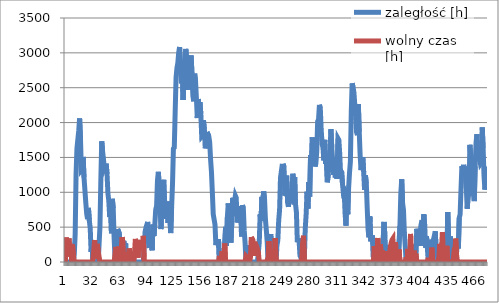
| Category | zaległość [h] | wolny czas [h] |
|---|---|---|
| 0 | 40 | 0 |
| 1 | 0 | 352 |
| 2 | 0 | 124 |
| 3 | 0 | 181 |
| 4 | 0 | 338 |
| 5 | 0 | 81 |
| 6 | 0 | 260 |
| 7 | 0 | 3 |
| 8 | 0 | 248 |
| 9 | 0 | 95 |
| 10 | 114 | 0 |
| 11 | 401 | 0 |
| 12 | 1257 | 0 |
| 13 | 1628 | 0 |
| 14 | 1640 | 0 |
| 15 | 1880 | 0 |
| 16 | 2059 | 0 |
| 17 | 1775 | 0 |
| 18 | 1319 | 0 |
| 19 | 1335 | 0 |
| 20 | 1507 | 0 |
| 21 | 1209 | 0 |
| 22 | 1223 | 0 |
| 23 | 851 | 0 |
| 24 | 693 | 0 |
| 25 | 614 | 0 |
| 26 | 776 | 0 |
| 27 | 593 | 0 |
| 28 | 486 | 0 |
| 29 | 145 | 0 |
| 30 | 280 | 0 |
| 31 | 0 | 30 |
| 32 | 0 | 174 |
| 33 | 0 | 314 |
| 34 | 0 | 52 |
| 35 | 0 | 99 |
| 36 | 0 | 260 |
| 37 | 0 | 154 |
| 38 | 0 | 77 |
| 39 | 506 | 0 |
| 40 | 1173 | 0 |
| 41 | 1731 | 0 |
| 42 | 1585 | 0 |
| 43 | 1471 | 0 |
| 44 | 1342 | 0 |
| 45 | 1370 | 0 |
| 46 | 1411 | 0 |
| 47 | 1264 | 0 |
| 48 | 984 | 0 |
| 49 | 876 | 0 |
| 50 | 645 | 0 |
| 51 | 805 | 0 |
| 52 | 412 | 0 |
| 53 | 906 | 0 |
| 54 | 771 | 0 |
| 55 | 350 | 0 |
| 56 | 69 | 0 |
| 57 | 0 | 218 |
| 58 | 0 | 182 |
| 59 | 473 | 0 |
| 60 | 476 | 0 |
| 61 | 405 | 0 |
| 62 | 198 | 0 |
| 63 | 0 | 181 |
| 64 | 0 | 356 |
| 65 | 0 | 274 |
| 66 | 304 | 0 |
| 67 | 0 | 77 |
| 68 | 267 | 0 |
| 69 | 0 | 21 |
| 70 | 132 | 0 |
| 71 | 0 | 1 |
| 72 | 0 | 194 |
| 73 | 0 | 140 |
| 74 | 0 | 8 |
| 75 | 71 | 0 |
| 76 | 0 | 115 |
| 77 | 29 | 0 |
| 78 | 0 | 115 |
| 79 | 0 | 331 |
| 80 | 0 | 271 |
| 81 | 0 | 312 |
| 82 | 0 | 63 |
| 83 | 0 | 305 |
| 84 | 0 | 214 |
| 85 | 0 | 317 |
| 86 | 0 | 239 |
| 87 | 0 | 223 |
| 88 | 0 | 375 |
| 89 | 220 | 0 |
| 90 | 430 | 0 |
| 91 | 494 | 0 |
| 92 | 485 | 0 |
| 93 | 575 | 0 |
| 94 | 287 | 0 |
| 95 | 202 | 0 |
| 96 | 282 | 0 |
| 97 | 322 | 0 |
| 98 | 168 | 0 |
| 99 | 536 | 0 |
| 100 | 376 | 0 |
| 101 | 534 | 0 |
| 102 | 750 | 0 |
| 103 | 800 | 0 |
| 104 | 1169 | 0 |
| 105 | 1293 | 0 |
| 106 | 1077 | 0 |
| 107 | 777 | 0 |
| 108 | 472 | 0 |
| 109 | 821 | 0 |
| 110 | 742 | 0 |
| 111 | 1179 | 0 |
| 112 | 885 | 0 |
| 113 | 818 | 0 |
| 114 | 620 | 0 |
| 115 | 810 | 0 |
| 116 | 562 | 0 |
| 117 | 867 | 0 |
| 118 | 572 | 0 |
| 119 | 415 | 0 |
| 120 | 789 | 0 |
| 121 | 1123 | 0 |
| 122 | 1626 | 0 |
| 123 | 1642 | 0 |
| 124 | 2155 | 0 |
| 125 | 2644 | 0 |
| 126 | 2783 | 0 |
| 127 | 2854 | 0 |
| 128 | 3006 | 0 |
| 129 | 3084 | 0 |
| 130 | 2784 | 0 |
| 131 | 2561 | 0 |
| 132 | 2747 | 0 |
| 133 | 2324 | 0 |
| 134 | 2777 | 0 |
| 135 | 2784 | 0 |
| 136 | 3057 | 0 |
| 137 | 2922 | 0 |
| 138 | 2589 | 0 |
| 139 | 2470 | 0 |
| 140 | 2691 | 0 |
| 141 | 2879 | 0 |
| 142 | 2963 | 0 |
| 143 | 2693 | 0 |
| 144 | 2381 | 0 |
| 145 | 2306 | 0 |
| 146 | 2701 | 0 |
| 147 | 2601 | 0 |
| 148 | 2351 | 0 |
| 149 | 2065 | 0 |
| 150 | 2337 | 0 |
| 151 | 2203 | 0 |
| 152 | 2293 | 0 |
| 153 | 2124 | 0 |
| 154 | 1800 | 0 |
| 155 | 1815 | 0 |
| 156 | 2035 | 0 |
| 157 | 1893 | 0 |
| 158 | 1630 | 0 |
| 159 | 1698 | 0 |
| 160 | 1864 | 0 |
| 161 | 1877 | 0 |
| 162 | 1804 | 0 |
| 163 | 1719 | 0 |
| 164 | 1476 | 0 |
| 165 | 1294 | 0 |
| 166 | 1003 | 0 |
| 167 | 686 | 0 |
| 168 | 681 | 0 |
| 169 | 536 | 0 |
| 170 | 241 | 0 |
| 171 | 286 | 0 |
| 172 | 265 | 0 |
| 173 | 328 | 0 |
| 174 | 0 | 89 |
| 175 | 0 | 25 |
| 176 | 126 | 0 |
| 177 | 0 | 154 |
| 178 | 149 | 0 |
| 179 | 0 | 103 |
| 180 | 0 | 266 |
| 181 | 503 | 0 |
| 182 | 233 | 0 |
| 183 | 647 | 0 |
| 184 | 840 | 0 |
| 185 | 644 | 0 |
| 186 | 612 | 0 |
| 187 | 278 | 0 |
| 188 | 571 | 0 |
| 189 | 921 | 0 |
| 190 | 658 | 0 |
| 191 | 859 | 0 |
| 192 | 951 | 0 |
| 193 | 921 | 0 |
| 194 | 567 | 0 |
| 195 | 643 | 0 |
| 196 | 573 | 0 |
| 197 | 802 | 0 |
| 198 | 715 | 0 |
| 199 | 366 | 0 |
| 200 | 814 | 0 |
| 201 | 777 | 0 |
| 202 | 457 | 0 |
| 203 | 277 | 0 |
| 204 | 0 | 83 |
| 205 | 0 | 68 |
| 206 | 239 | 0 |
| 207 | 66 | 0 |
| 208 | 50 | 0 |
| 209 | 0 | 64 |
| 210 | 0 | 357 |
| 211 | 0 | 358 |
| 212 | 0 | 305 |
| 213 | 0 | 86 |
| 214 | 0 | 290 |
| 215 | 0 | 204 |
| 216 | 0 | 168 |
| 217 | 0 | 184 |
| 218 | 0 | 142 |
| 219 | 276 | 0 |
| 220 | 683 | 0 |
| 221 | 589 | 0 |
| 222 | 934 | 0 |
| 223 | 863 | 0 |
| 224 | 1012 | 0 |
| 225 | 901 | 0 |
| 226 | 609 | 0 |
| 227 | 459 | 0 |
| 228 | 285 | 0 |
| 229 | 0 | 63 |
| 230 | 0 | 301 |
| 231 | 313 | 0 |
| 232 | 401 | 0 |
| 233 | 194 | 0 |
| 234 | 0 | 103 |
| 235 | 263 | 0 |
| 236 | 0 | 98 |
| 237 | 0 | 344 |
| 238 | 0 | 12 |
| 239 | 239 | 0 |
| 240 | 310 | 0 |
| 241 | 597 | 0 |
| 242 | 751 | 0 |
| 243 | 1208 | 0 |
| 244 | 1300 | 0 |
| 245 | 1274 | 0 |
| 246 | 1408 | 0 |
| 247 | 1363 | 0 |
| 248 | 952 | 0 |
| 249 | 1182 | 0 |
| 250 | 1241 | 0 |
| 251 | 854 | 0 |
| 252 | 792 | 0 |
| 253 | 926 | 0 |
| 254 | 919 | 0 |
| 255 | 897 | 0 |
| 256 | 894 | 0 |
| 257 | 1266 | 0 |
| 258 | 1141 | 0 |
| 259 | 1218 | 0 |
| 260 | 829 | 0 |
| 261 | 713 | 0 |
| 262 | 314 | 0 |
| 263 | 324 | 0 |
| 264 | 310 | 0 |
| 265 | 93 | 0 |
| 266 | 67 | 0 |
| 267 | 0 | 34 |
| 268 | 0 | 269 |
| 269 | 0 | 376 |
| 270 | 76 | 0 |
| 271 | 483 | 0 |
| 272 | 682 | 0 |
| 273 | 1008 | 0 |
| 274 | 767 | 0 |
| 275 | 1148 | 0 |
| 276 | 939 | 0 |
| 277 | 1535 | 0 |
| 278 | 1428 | 0 |
| 279 | 1787 | 0 |
| 280 | 1507 | 0 |
| 281 | 1565 | 0 |
| 282 | 1371 | 0 |
| 283 | 1418 | 0 |
| 284 | 1584 | 0 |
| 285 | 2017 | 0 |
| 286 | 2042 | 0 |
| 287 | 2255 | 0 |
| 288 | 2202 | 0 |
| 289 | 1903 | 0 |
| 290 | 1691 | 0 |
| 291 | 1642 | 0 |
| 292 | 1457 | 0 |
| 293 | 1752 | 0 |
| 294 | 1408 | 0 |
| 295 | 1433 | 0 |
| 296 | 1144 | 0 |
| 297 | 1258 | 0 |
| 298 | 1495 | 0 |
| 299 | 1573 | 0 |
| 300 | 1906 | 0 |
| 301 | 1638 | 0 |
| 302 | 1624 | 0 |
| 303 | 1250 | 0 |
| 304 | 1388 | 0 |
| 305 | 1213 | 0 |
| 306 | 1339 | 0 |
| 307 | 1193 | 0 |
| 308 | 1771 | 0 |
| 309 | 1748 | 0 |
| 310 | 1544 | 0 |
| 311 | 1249 | 0 |
| 312 | 1309 | 0 |
| 313 | 1131 | 0 |
| 314 | 994 | 0 |
| 315 | 1009 | 0 |
| 316 | 696 | 0 |
| 317 | 521 | 0 |
| 318 | 991 | 0 |
| 319 | 685 | 0 |
| 320 | 1062 | 0 |
| 321 | 1279 | 0 |
| 322 | 1440 | 0 |
| 323 | 2153 | 0 |
| 324 | 2563 | 0 |
| 325 | 2512 | 0 |
| 326 | 2431 | 0 |
| 327 | 2248 | 0 |
| 328 | 2083 | 0 |
| 329 | 1862 | 0 |
| 330 | 1820 | 0 |
| 331 | 2265 | 0 |
| 332 | 1868 | 0 |
| 333 | 1538 | 0 |
| 334 | 1317 | 0 |
| 335 | 1324 | 0 |
| 336 | 1503 | 0 |
| 337 | 1294 | 0 |
| 338 | 1034 | 0 |
| 339 | 1243 | 0 |
| 340 | 1124 | 0 |
| 341 | 775 | 0 |
| 342 | 464 | 0 |
| 343 | 354 | 0 |
| 344 | 654 | 0 |
| 345 | 295 | 0 |
| 346 | 330 | 0 |
| 347 | 384 | 0 |
| 348 | 63 | 0 |
| 349 | 0 | 226 |
| 350 | 30 | 0 |
| 351 | 250 | 0 |
| 352 | 0 | 132 |
| 353 | 0 | 345 |
| 354 | 81 | 0 |
| 355 | 0 | 47 |
| 356 | 0 | 258 |
| 357 | 30 | 0 |
| 358 | 0 | 165 |
| 359 | 0 | 31 |
| 360 | 574 | 0 |
| 361 | 377 | 0 |
| 362 | 131 | 0 |
| 363 | 0 | 155 |
| 364 | 166 | 0 |
| 365 | 75 | 0 |
| 366 | 63 | 0 |
| 367 | 0 | 218 |
| 368 | 0 | 266 |
| 369 | 0 | 315 |
| 370 | 0 | 335 |
| 371 | 181 | 0 |
| 372 | 0 | 38 |
| 373 | 0 | 287 |
| 374 | 116 | 0 |
| 375 | 209 | 0 |
| 376 | 0 | 72 |
| 377 | 0 | 182 |
| 378 | 519 | 0 |
| 379 | 989 | 0 |
| 380 | 1187 | 0 |
| 381 | 843 | 0 |
| 382 | 746 | 0 |
| 383 | 416 | 0 |
| 384 | 228 | 0 |
| 385 | 0 | 67 |
| 386 | 128 | 0 |
| 387 | 0 | 187 |
| 388 | 46 | 0 |
| 389 | 0 | 54 |
| 390 | 0 | 403 |
| 391 | 241 | 0 |
| 392 | 199 | 0 |
| 393 | 226 | 0 |
| 394 | 0 | 163 |
| 395 | 0 | 68 |
| 396 | 0 | 118 |
| 397 | 477 | 0 |
| 398 | 473 | 0 |
| 399 | 254 | 0 |
| 400 | 362 | 0 |
| 401 | 230 | 0 |
| 402 | 543 | 0 |
| 403 | 599 | 0 |
| 404 | 506 | 0 |
| 405 | 684 | 0 |
| 406 | 523 | 0 |
| 407 | 205 | 0 |
| 408 | 371 | 0 |
| 409 | 196 | 0 |
| 410 | 0 | 61 |
| 411 | 60 | 0 |
| 412 | 319 | 0 |
| 413 | 101 | 0 |
| 414 | 0 | 206 |
| 415 | 303 | 0 |
| 416 | 328 | 0 |
| 417 | 338 | 0 |
| 418 | 440 | 0 |
| 419 | 96 | 0 |
| 420 | 148 | 0 |
| 421 | 15 | 0 |
| 422 | 0 | 73 |
| 423 | 0 | 261 |
| 424 | 0 | 132 |
| 425 | 0 | 200 |
| 426 | 0 | 429 |
| 427 | 84 | 0 |
| 428 | 162 | 0 |
| 429 | 112 | 0 |
| 430 | 106 | 0 |
| 431 | 0 | 232 |
| 432 | 717 | 0 |
| 433 | 355 | 0 |
| 434 | 0 | 4 |
| 435 | 365 | 0 |
| 436 | 214 | 0 |
| 437 | 167 | 0 |
| 438 | 217 | 0 |
| 439 | 0 | 131 |
| 440 | 0 | 116 |
| 441 | 0 | 336 |
| 442 | 0 | 104 |
| 443 | 274 | 0 |
| 444 | 194 | 0 |
| 445 | 633 | 0 |
| 446 | 684 | 0 |
| 447 | 1043 | 0 |
| 448 | 1377 | 0 |
| 449 | 1338 | 0 |
| 450 | 1394 | 0 |
| 451 | 1297 | 0 |
| 452 | 1369 | 0 |
| 453 | 1058 | 0 |
| 454 | 764 | 0 |
| 455 | 939 | 0 |
| 456 | 962 | 0 |
| 457 | 1681 | 0 |
| 458 | 1527 | 0 |
| 459 | 1417 | 0 |
| 460 | 1224 | 0 |
| 461 | 973 | 0 |
| 462 | 874 | 0 |
| 463 | 1373 | 0 |
| 464 | 1710 | 0 |
| 465 | 1834 | 0 |
| 466 | 1451 | 0 |
| 467 | 1540 | 0 |
| 468 | 1485 | 0 |
| 469 | 1408 | 0 |
| 470 | 1427 | 0 |
| 471 | 1931 | 0 |
| 472 | 1635 | 0 |
| 473 | 1236 | 0 |
| 474 | 1039 | 0 |
| 475 | 1119 | 0 |
| 476 | 1367 | 0 |
| 477 | 1181 | 0 |